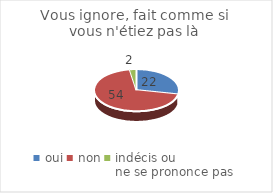
| Category | Vous ignore, fait comme si vous n'étiez pas là |
|---|---|
| oui | 22 |
| non | 54 |
| indécis ou 
ne se prononce pas | 2 |